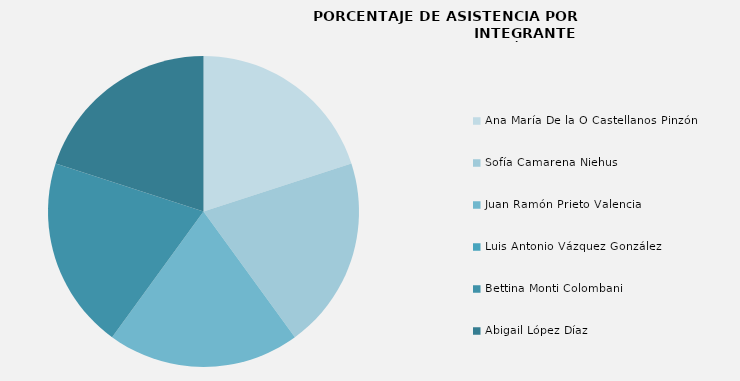
| Category | Series 0 |
|---|---|
| Ana María De la O Castellanos Pinzón | 100 |
| Sofía Camarena Niehus | 100 |
| Juan Ramón Prieto Valencia  | 100 |
| Luis Antonio Vázquez González | 0 |
| Bettina Monti Colombani | 100 |
| Abigail López Díaz | 100 |